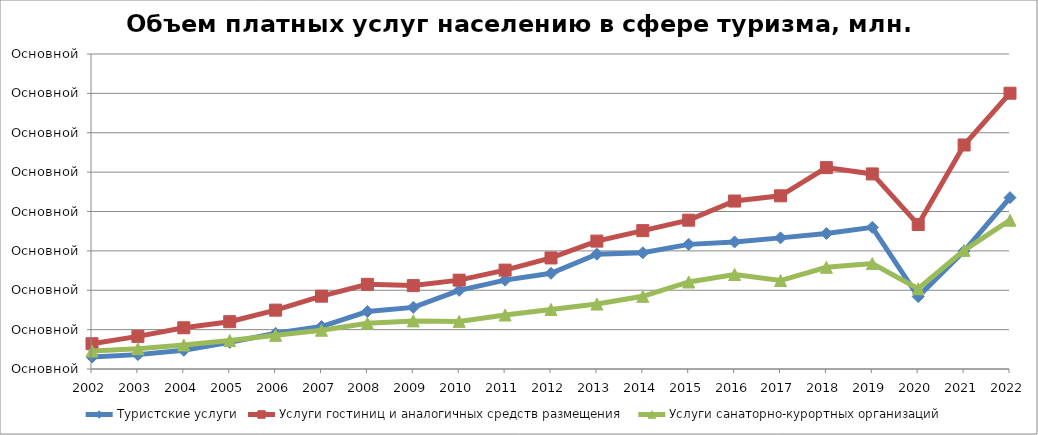
| Category | Туристские услуги | Услуги гостиниц и аналогичных средств размещения | Услуги санаторно-курортных организаций |
|---|---|---|---|
| 2002.0 | 15156.784 | 32103.639 | 22902.027 |
| 2003.0 | 18251.163 | 41429.807 | 25770.583 |
| 2004.0 | 23766.615 | 52341.684 | 30469.24 |
| 2005.0 | 33848.803 | 60098.124 | 36082.437 |
| 2006.0 | 45312.019 | 74743.723 | 42765.604 |
| 2007.0 | 53960.576 | 92479.57 | 49158.453 |
| 2008.0 | 72975.461 | 107521.663 | 58124.687 |
| 2009.0 | 78227.59 | 105903.557 | 61090.111 |
| 2010.0 | 99879 | 112855 | 60460 |
| 2011.0 | 112829 | 125541 | 68521 |
| 2012.0 | 121545 | 141012 | 75622 |
| 2013.0 | 145784 | 162387 | 82444 |
| 2014.0 | 147541 | 175709 | 92300 |
| 2015.0 | 158252 | 188992 | 110513 |
| 2016.0 | 161344 | 213288 | 120009 |
| 2017.0 | 166520 | 219916 | 112305 |
| 2018.0 | 172090 | 255708 | 129147 |
| 2019.0 | 179826 | 247702 | 133873 |
| 2020.0 | 91884.154 | 183407.272 | 101882.187 |
| 2021.0 | 149751.115 | 284461.439 | 150677.883 |
| 2022.0 | 217609.616 | 350188.867 | 188941.024 |